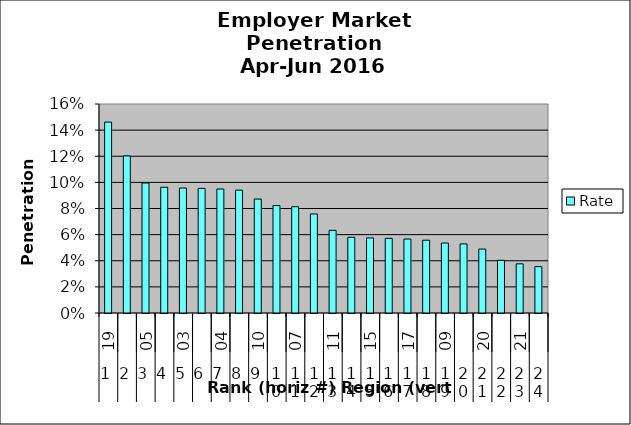
| Category | Rate |
|---|---|
| 0 | 0.146 |
| 1 | 0.12 |
| 2 | 0.1 |
| 3 | 0.096 |
| 4 | 0.096 |
| 5 | 0.095 |
| 6 | 0.095 |
| 7 | 0.094 |
| 8 | 0.087 |
| 9 | 0.082 |
| 10 | 0.081 |
| 11 | 0.076 |
| 12 | 0.063 |
| 13 | 0.058 |
| 14 | 0.057 |
| 15 | 0.057 |
| 16 | 0.057 |
| 17 | 0.056 |
| 18 | 0.054 |
| 19 | 0.053 |
| 20 | 0.049 |
| 21 | 0.04 |
| 22 | 0.038 |
| 23 | 0.035 |